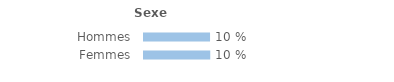
| Category | Series 0 |
|---|---|
| Hommes | 0.099 |
| Femmes | 0.099 |